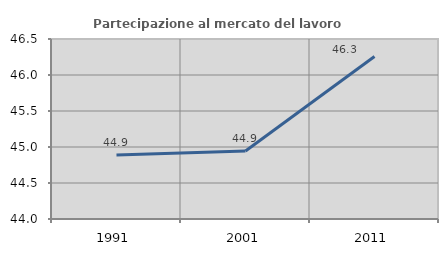
| Category | Partecipazione al mercato del lavoro  femminile |
|---|---|
| 1991.0 | 44.89 |
| 2001.0 | 44.944 |
| 2011.0 | 46.257 |